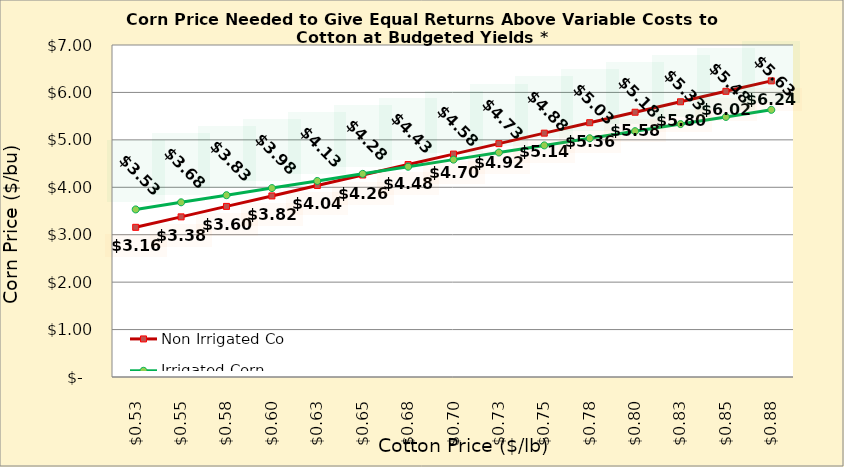
| Category | Non Irrigated Corn | Irrigated Corn |
|---|---|---|
| 0.5249999999999998 | 3.156 | 3.533 |
| 0.5499999999999998 | 3.376 | 3.683 |
| 0.5749999999999998 | 3.597 | 3.833 |
| 0.5999999999999999 | 3.818 | 3.983 |
| 0.6249999999999999 | 4.038 | 4.133 |
| 0.6499999999999999 | 4.259 | 4.283 |
| 0.6749999999999999 | 4.479 | 4.433 |
| 0.7 | 4.7 | 4.583 |
| 0.725 | 4.921 | 4.733 |
| 0.75 | 5.141 | 4.883 |
| 0.775 | 5.362 | 5.033 |
| 0.8 | 5.582 | 5.183 |
| 0.8250000000000001 | 5.803 | 5.333 |
| 0.8500000000000001 | 6.023 | 5.483 |
| 0.8750000000000001 | 6.244 | 5.633 |